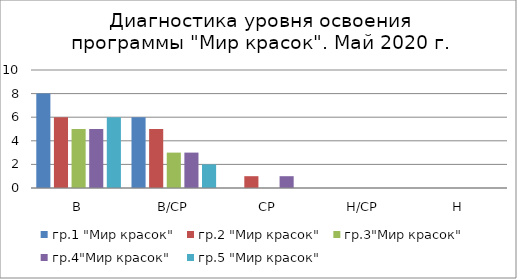
| Category | гр.1 "Мир красок" | гр.2 "Мир красок" | гр.3"Мир красок" | гр.4"Мир красок" | гр.5 "Мир красок" |
|---|---|---|---|---|---|
| В | 8 | 6 | 5 | 5 | 6 |
| В/СР | 6 | 5 | 3 | 3 | 2 |
| СР | 0 | 1 | 0 | 1 | 0 |
| Н/СР | 0 | 0 | 0 | 0 | 0 |
| Н | 0 | 0 | 0 | 0 | 0 |